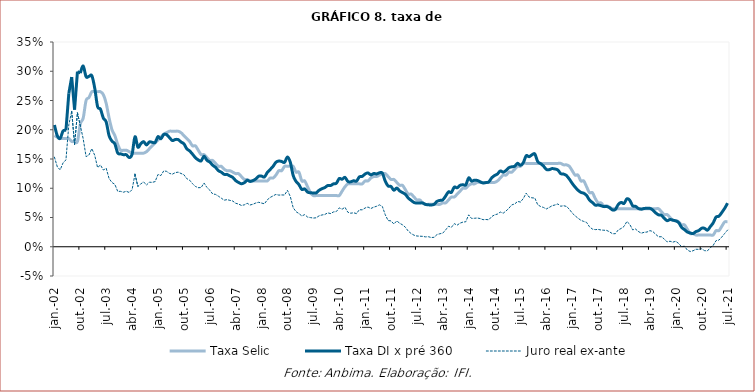
| Category | Taxa Selic | Taxa DI x pré 360 | Juro real ex-ante |
|---|---|---|---|
| 2002-01-01 | 0.19 | 0.208 | 0.153 |
| 2002-02-01 | 0.188 | 0.19 | 0.137 |
| 2002-03-01 | 0.185 | 0.185 | 0.131 |
| 2002-04-01 | 0.185 | 0.198 | 0.143 |
| 2002-05-01 | 0.185 | 0.199 | 0.148 |
| 2002-06-01 | 0.185 | 0.262 | 0.209 |
| 2002-07-01 | 0.18 | 0.29 | 0.231 |
| 2002-08-01 | 0.18 | 0.234 | 0.175 |
| 2002-09-01 | 0.18 | 0.299 | 0.229 |
| 2002-10-01 | 0.21 | 0.297 | 0.207 |
| 2002-11-01 | 0.22 | 0.309 | 0.184 |
| 2002-12-01 | 0.25 | 0.291 | 0.154 |
| 2003-01-01 | 0.255 | 0.291 | 0.157 |
| 2003-02-01 | 0.265 | 0.292 | 0.168 |
| 2003-03-01 | 0.265 | 0.271 | 0.156 |
| 2003-04-01 | 0.265 | 0.24 | 0.135 |
| 2003-05-01 | 0.265 | 0.235 | 0.14 |
| 2003-06-01 | 0.26 | 0.22 | 0.131 |
| 2003-07-01 | 0.245 | 0.213 | 0.134 |
| 2003-08-01 | 0.22 | 0.19 | 0.117 |
| 2003-09-01 | 0.2 | 0.181 | 0.11 |
| 2003-10-01 | 0.19 | 0.176 | 0.107 |
| 2003-11-01 | 0.175 | 0.16 | 0.095 |
| 2003-12-01 | 0.165 | 0.159 | 0.095 |
| 2004-01-01 | 0.165 | 0.157 | 0.093 |
| 2004-02-01 | 0.165 | 0.157 | 0.095 |
| 2004-03-01 | 0.162 | 0.152 | 0.093 |
| 2004-04-01 | 0.16 | 0.158 | 0.098 |
| 2004-05-01 | 0.16 | 0.188 | 0.124 |
| 2004-06-01 | 0.16 | 0.17 | 0.103 |
| 2004-07-01 | 0.16 | 0.176 | 0.107 |
| 2004-08-01 | 0.16 | 0.18 | 0.111 |
| 2004-09-01 | 0.162 | 0.174 | 0.105 |
| 2004-10-01 | 0.168 | 0.179 | 0.11 |
| 2004-11-01 | 0.172 | 0.179 | 0.11 |
| 2004-12-01 | 0.178 | 0.178 | 0.111 |
| 2005-01-01 | 0.182 | 0.188 | 0.124 |
| 2005-02-01 | 0.188 | 0.185 | 0.122 |
| 2005-03-01 | 0.192 | 0.192 | 0.13 |
| 2005-04-01 | 0.195 | 0.192 | 0.129 |
| 2005-05-01 | 0.198 | 0.186 | 0.125 |
| 2005-06-01 | 0.198 | 0.182 | 0.124 |
| 2005-07-01 | 0.198 | 0.183 | 0.127 |
| 2005-08-01 | 0.198 | 0.183 | 0.128 |
| 2005-09-01 | 0.195 | 0.179 | 0.125 |
| 2005-10-01 | 0.19 | 0.176 | 0.123 |
| 2005-11-01 | 0.185 | 0.168 | 0.116 |
| 2005-12-01 | 0.18 | 0.164 | 0.114 |
| 2006-01-01 | 0.172 | 0.158 | 0.108 |
| 2006-02-01 | 0.172 | 0.152 | 0.103 |
| 2006-03-01 | 0.165 | 0.148 | 0.101 |
| 2006-04-01 | 0.158 | 0.147 | 0.101 |
| 2006-05-01 | 0.158 | 0.155 | 0.109 |
| 2006-06-01 | 0.152 | 0.148 | 0.101 |
| 2006-07-01 | 0.148 | 0.145 | 0.097 |
| 2006-08-01 | 0.148 | 0.139 | 0.09 |
| 2006-09-01 | 0.142 | 0.136 | 0.089 |
| 2006-10-01 | 0.138 | 0.13 | 0.086 |
| 2006-11-01 | 0.138 | 0.128 | 0.083 |
| 2006-12-01 | 0.132 | 0.124 | 0.08 |
| 2007-01-01 | 0.13 | 0.124 | 0.081 |
| 2007-02-01 | 0.13 | 0.121 | 0.079 |
| 2007-03-01 | 0.128 | 0.118 | 0.078 |
| 2007-04-01 | 0.125 | 0.113 | 0.074 |
| 2007-05-01 | 0.125 | 0.11 | 0.073 |
| 2007-06-01 | 0.12 | 0.108 | 0.071 |
| 2007-07-01 | 0.115 | 0.109 | 0.072 |
| 2007-08-01 | 0.115 | 0.114 | 0.074 |
| 2007-09-01 | 0.112 | 0.112 | 0.071 |
| 2007-10-01 | 0.112 | 0.113 | 0.073 |
| 2007-11-01 | 0.112 | 0.116 | 0.075 |
| 2007-12-01 | 0.112 | 0.121 | 0.076 |
| 2008-01-01 | 0.112 | 0.121 | 0.075 |
| 2008-02-01 | 0.112 | 0.119 | 0.073 |
| 2008-03-01 | 0.112 | 0.127 | 0.08 |
| 2008-04-01 | 0.118 | 0.132 | 0.084 |
| 2008-05-01 | 0.118 | 0.137 | 0.087 |
| 2008-06-01 | 0.122 | 0.144 | 0.089 |
| 2008-07-01 | 0.13 | 0.147 | 0.088 |
| 2008-08-01 | 0.13 | 0.146 | 0.089 |
| 2008-09-01 | 0.138 | 0.144 | 0.088 |
| 2008-10-01 | 0.138 | 0.153 | 0.096 |
| 2008-11-01 | 0.138 | 0.144 | 0.086 |
| 2008-12-01 | 0.138 | 0.122 | 0.067 |
| 2009-01-01 | 0.128 | 0.112 | 0.06 |
| 2009-02-01 | 0.128 | 0.106 | 0.057 |
| 2009-03-01 | 0.112 | 0.098 | 0.053 |
| 2009-04-01 | 0.112 | 0.099 | 0.055 |
| 2009-05-01 | 0.102 | 0.093 | 0.051 |
| 2009-06-01 | 0.092 | 0.092 | 0.05 |
| 2009-07-01 | 0.088 | 0.092 | 0.049 |
| 2009-08-01 | 0.088 | 0.092 | 0.05 |
| 2009-09-01 | 0.088 | 0.096 | 0.053 |
| 2009-10-01 | 0.088 | 0.099 | 0.054 |
| 2009-11-01 | 0.088 | 0.101 | 0.055 |
| 2009-12-01 | 0.088 | 0.105 | 0.058 |
| 2010-01-01 | 0.088 | 0.105 | 0.057 |
| 2010-02-01 | 0.088 | 0.108 | 0.059 |
| 2010-03-01 | 0.088 | 0.108 | 0.06 |
| 2010-04-01 | 0.088 | 0.117 | 0.066 |
| 2010-05-01 | 0.095 | 0.115 | 0.064 |
| 2010-06-01 | 0.102 | 0.119 | 0.067 |
| 2010-07-01 | 0.108 | 0.112 | 0.059 |
| 2010-08-01 | 0.108 | 0.111 | 0.057 |
| 2010-09-01 | 0.108 | 0.113 | 0.058 |
| 2010-10-01 | 0.108 | 0.112 | 0.057 |
| 2010-11-01 | 0.108 | 0.119 | 0.063 |
| 2010-12-01 | 0.108 | 0.12 | 0.063 |
| 2011-01-01 | 0.112 | 0.124 | 0.066 |
| 2011-02-01 | 0.112 | 0.126 | 0.068 |
| 2011-03-01 | 0.118 | 0.123 | 0.065 |
| 2011-04-01 | 0.12 | 0.125 | 0.068 |
| 2011-05-01 | 0.12 | 0.124 | 0.069 |
| 2011-06-01 | 0.122 | 0.126 | 0.072 |
| 2011-07-01 | 0.125 | 0.126 | 0.069 |
| 2011-08-01 | 0.125 | 0.112 | 0.055 |
| 2011-09-01 | 0.12 | 0.104 | 0.045 |
| 2011-10-01 | 0.115 | 0.103 | 0.044 |
| 2011-11-01 | 0.115 | 0.097 | 0.039 |
| 2011-12-01 | 0.11 | 0.1 | 0.044 |
| 2012-01-01 | 0.105 | 0.096 | 0.04 |
| 2012-02-01 | 0.105 | 0.093 | 0.037 |
| 2012-03-01 | 0.098 | 0.09 | 0.033 |
| 2012-04-01 | 0.09 | 0.083 | 0.027 |
| 2012-05-01 | 0.09 | 0.079 | 0.023 |
| 2012-06-01 | 0.085 | 0.076 | 0.02 |
| 2012-07-01 | 0.08 | 0.075 | 0.018 |
| 2012-08-01 | 0.08 | 0.075 | 0.018 |
| 2012-09-01 | 0.075 | 0.075 | 0.018 |
| 2012-10-01 | 0.072 | 0.072 | 0.017 |
| 2012-11-01 | 0.072 | 0.072 | 0.017 |
| 2012-12-01 | 0.072 | 0.071 | 0.016 |
| 2013-01-01 | 0.072 | 0.073 | 0.016 |
| 2013-02-01 | 0.072 | 0.078 | 0.021 |
| 2013-03-01 | 0.072 | 0.079 | 0.022 |
| 2013-04-01 | 0.075 | 0.08 | 0.023 |
| 2013-05-01 | 0.075 | 0.087 | 0.029 |
| 2013-06-01 | 0.08 | 0.094 | 0.035 |
| 2013-07-01 | 0.085 | 0.093 | 0.033 |
| 2013-08-01 | 0.085 | 0.102 | 0.04 |
| 2013-09-01 | 0.09 | 0.101 | 0.037 |
| 2013-10-01 | 0.095 | 0.105 | 0.04 |
| 2013-11-01 | 0.1 | 0.106 | 0.042 |
| 2013-12-01 | 0.1 | 0.106 | 0.043 |
| 2014-01-01 | 0.105 | 0.118 | 0.055 |
| 2014-02-01 | 0.108 | 0.112 | 0.048 |
| 2014-03-01 | 0.108 | 0.114 | 0.049 |
| 2014-04-01 | 0.11 | 0.113 | 0.049 |
| 2014-05-01 | 0.11 | 0.111 | 0.048 |
| 2014-06-01 | 0.11 | 0.109 | 0.046 |
| 2014-07-01 | 0.11 | 0.11 | 0.047 |
| 2014-08-01 | 0.11 | 0.111 | 0.046 |
| 2014-09-01 | 0.11 | 0.118 | 0.052 |
| 2014-10-01 | 0.11 | 0.122 | 0.054 |
| 2014-11-01 | 0.112 | 0.124 | 0.056 |
| 2014-12-01 | 0.118 | 0.13 | 0.059 |
| 2015-01-01 | 0.122 | 0.128 | 0.057 |
| 2015-02-01 | 0.122 | 0.13 | 0.061 |
| 2015-03-01 | 0.128 | 0.135 | 0.066 |
| 2015-04-01 | 0.128 | 0.137 | 0.072 |
| 2015-05-01 | 0.132 | 0.138 | 0.073 |
| 2015-06-01 | 0.138 | 0.143 | 0.077 |
| 2015-07-01 | 0.138 | 0.139 | 0.076 |
| 2015-08-01 | 0.142 | 0.144 | 0.083 |
| 2015-09-01 | 0.142 | 0.156 | 0.092 |
| 2015-10-01 | 0.142 | 0.154 | 0.085 |
| 2015-11-01 | 0.142 | 0.157 | 0.084 |
| 2015-12-01 | 0.142 | 0.159 | 0.083 |
| 2016-01-01 | 0.142 | 0.146 | 0.072 |
| 2016-02-01 | 0.142 | 0.142 | 0.069 |
| 2016-03-01 | 0.142 | 0.138 | 0.067 |
| 2016-04-01 | 0.142 | 0.132 | 0.065 |
| 2016-05-01 | 0.142 | 0.132 | 0.067 |
| 2016-06-01 | 0.142 | 0.134 | 0.07 |
| 2016-07-01 | 0.142 | 0.133 | 0.071 |
| 2016-08-01 | 0.142 | 0.131 | 0.073 |
| 2016-09-01 | 0.142 | 0.125 | 0.069 |
| 2016-10-01 | 0.14 | 0.124 | 0.07 |
| 2016-11-01 | 0.14 | 0.122 | 0.069 |
| 2016-12-01 | 0.138 | 0.116 | 0.064 |
| 2017-01-01 | 0.13 | 0.108 | 0.058 |
| 2017-02-01 | 0.122 | 0.102 | 0.053 |
| 2017-03-01 | 0.122 | 0.097 | 0.049 |
| 2017-04-01 | 0.112 | 0.093 | 0.045 |
| 2017-05-01 | 0.112 | 0.092 | 0.043 |
| 2017-06-01 | 0.102 | 0.088 | 0.042 |
| 2017-07-01 | 0.092 | 0.08 | 0.034 |
| 2017-08-01 | 0.092 | 0.076 | 0.03 |
| 2017-09-01 | 0.082 | 0.071 | 0.029 |
| 2017-10-01 | 0.075 | 0.071 | 0.03 |
| 2017-11-01 | 0.075 | 0.07 | 0.029 |
| 2017-12-01 | 0.07 | 0.069 | 0.028 |
| 2018-01-01 | 0.07 | 0.069 | 0.028 |
| 2018-02-01 | 0.068 | 0.067 | 0.025 |
| 2018-03-01 | 0.065 | 0.063 | 0.022 |
| 2018-04-01 | 0.065 | 0.064 | 0.022 |
| 2018-05-01 | 0.065 | 0.072 | 0.029 |
| 2018-06-01 | 0.065 | 0.076 | 0.031 |
| 2018-07-01 | 0.065 | 0.074 | 0.035 |
| 2018-08-01 | 0.065 | 0.082 | 0.043 |
| 2018-09-01 | 0.065 | 0.08 | 0.038 |
| 2018-10-01 | 0.065 | 0.07 | 0.029 |
| 2018-11-01 | 0.065 | 0.069 | 0.03 |
| 2018-12-01 | 0.065 | 0.065 | 0.026 |
| 2019-01-01 | 0.065 | 0.064 | 0.023 |
| 2019-02-01 | 0.065 | 0.065 | 0.025 |
| 2019-03-01 | 0.065 | 0.066 | 0.025 |
| 2019-04-01 | 0.065 | 0.066 | 0.028 |
| 2019-05-01 | 0.065 | 0.063 | 0.026 |
| 2019-06-01 | 0.065 | 0.058 | 0.021 |
| 2019-07-01 | 0.065 | 0.054 | 0.017 |
| 2019-08-01 | 0.06 | 0.054 | 0.017 |
| 2019-09-01 | 0.055 | 0.048 | 0.013 |
| 2019-10-01 | 0.055 | 0.045 | 0.008 |
| 2019-11-01 | 0.05 | 0.047 | 0.009 |
| 2019-12-01 | 0.045 | 0.046 | 0.008 |
| 2020-01-01 | 0.045 | 0.044 | 0.009 |
| 2020-02-01 | 0.042 | 0.041 | 0.006 |
| 2020-03-01 | 0.038 | 0.033 | 0 |
| 2020-04-01 | 0.038 | 0.029 | 0.001 |
| 2020-05-01 | 0.03 | 0.025 | -0.006 |
| 2020-06-01 | 0.022 | 0.024 | -0.008 |
| 2020-07-01 | 0.022 | 0.023 | -0.007 |
| 2020-08-01 | 0.02 | 0.026 | -0.004 |
| 2020-09-01 | 0.02 | 0.028 | -0.004 |
| 2020-10-01 | 0.02 | 0.032 | -0.003 |
| 2020-11-01 | 0.02 | 0.032 | -0.007 |
| 2020-12-01 | 0.02 | 0.028 | -0.007 |
| 2021-01-01 | 0.02 | 0.034 | -0.002 |
| 2021-02-01 | 0.02 | 0.041 | 0.002 |
| 2021-03-01 | 0.028 | 0.051 | 0.01 |
| 2021-04-01 | 0.028 | 0.052 | 0.011 |
| 2021-05-01 | 0.035 | 0.059 | 0.017 |
| 2021-06-01 | 0.042 | 0.066 | 0.023 |
| 2021-07-01 | 0.042 | 0.074 | 0.029 |